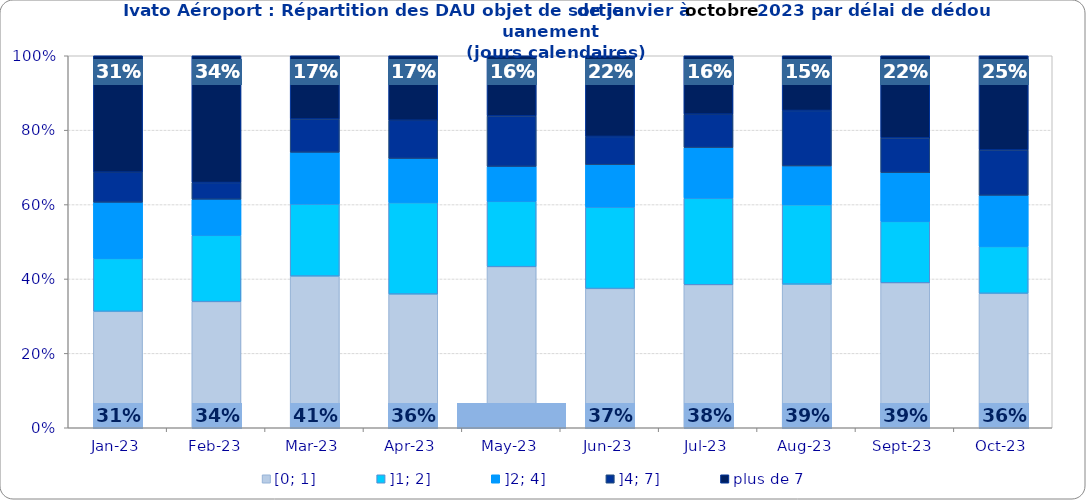
| Category | [0; 1] | ]1; 2] | ]2; 4] | ]4; 7] | plus de 7 |
|---|---|---|---|---|---|
| 2023-01-01 | 0.313 | 0.142 | 0.151 | 0.081 | 0.313 |
| 2023-02-01 | 0.339 | 0.178 | 0.097 | 0.045 | 0.341 |
| 2023-03-01 | 0.408 | 0.194 | 0.139 | 0.09 | 0.17 |
| 2023-04-01 | 0.359 | 0.246 | 0.119 | 0.103 | 0.173 |
| 2023-05-01 | 0.433 | 0.176 | 0.094 | 0.136 | 0.162 |
| 2023-06-01 | 0.374 | 0.219 | 0.114 | 0.076 | 0.217 |
| 2023-07-01 | 0.384 | 0.233 | 0.136 | 0.09 | 0.157 |
| 2023-08-01 | 0.386 | 0.214 | 0.104 | 0.149 | 0.147 |
| 2023-09-01 | 0.39 | 0.165 | 0.131 | 0.093 | 0.221 |
| 2023-10-01 | 0.361 | 0.126 | 0.137 | 0.122 | 0.253 |